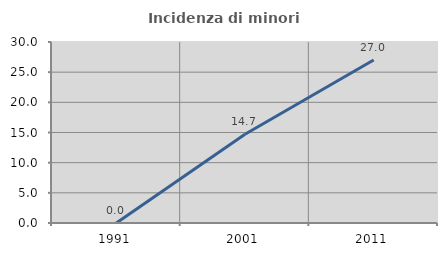
| Category | Incidenza di minori stranieri |
|---|---|
| 1991.0 | 0 |
| 2001.0 | 14.706 |
| 2011.0 | 27.007 |